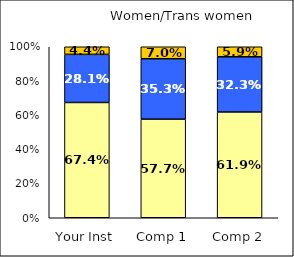
| Category | Low Institutional Priority: Increase Prestige | Average Institutional Priority: Increase Prestige | High Institutional Priority: Increase Prestige |
|---|---|---|---|
| Your Inst | 0.674 | 0.281 | 0.044 |
| Comp 1 | 0.577 | 0.353 | 0.07 |
| Comp 2 | 0.619 | 0.323 | 0.059 |